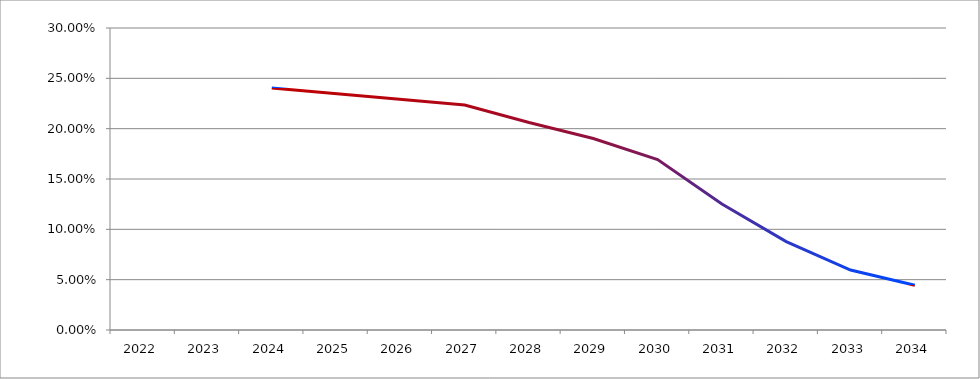
| Category | Series 0 |
|---|---|
| 2022.0 | 0 |
| 2023.0 | 0 |
| 2024.0 | 0.24 |
| 2025.0 | 0 |
| 2026.0 | 0 |
| 2027.0 | 0.224 |
| 2028.0 | 0.206 |
| 2029.0 | 0.19 |
| 2030.0 | 0.169 |
| 2031.0 | 0.125 |
| 2032.0 | 0.088 |
| 2033.0 | 0.06 |
| 2034.0 | 0.044 |